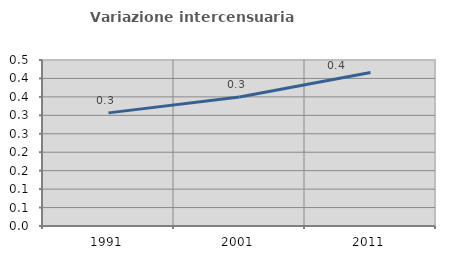
| Category | Variazione intercensuaria annua |
|---|---|
| 1991.0 | 0.307 |
| 2001.0 | 0.35 |
| 2011.0 | 0.416 |